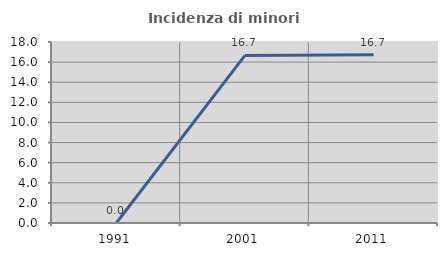
| Category | Incidenza di minori stranieri |
|---|---|
| 1991.0 | 0 |
| 2001.0 | 16.667 |
| 2011.0 | 16.744 |